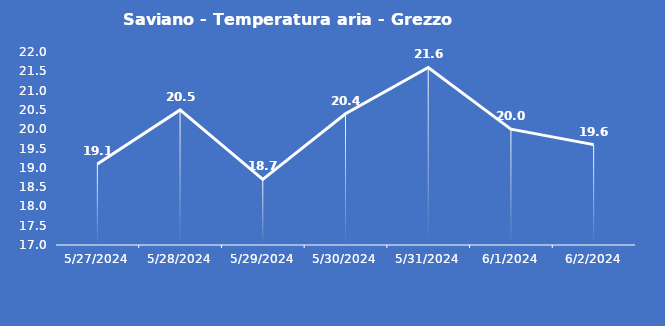
| Category | Saviano - Temperatura aria - Grezzo (°C) |
|---|---|
| 5/27/24 | 19.1 |
| 5/28/24 | 20.5 |
| 5/29/24 | 18.7 |
| 5/30/24 | 20.4 |
| 5/31/24 | 21.6 |
| 6/1/24 | 20 |
| 6/2/24 | 19.6 |